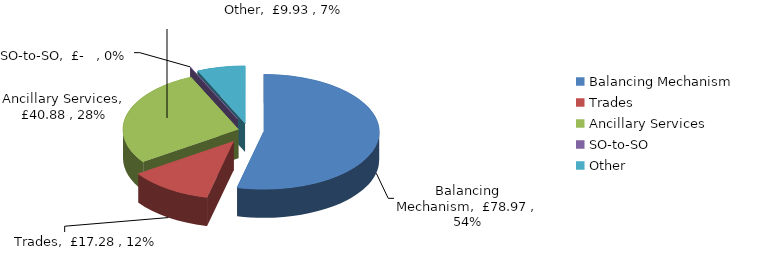
| Category | Series 0 |
|---|---|
| Balancing Mechanism | 78.973 |
| Trades | 17.275 |
| Ancillary Services | 40.882 |
| SO-to-SO | 0 |
| Other | 9.929 |